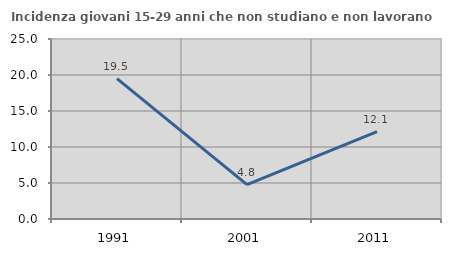
| Category | Incidenza giovani 15-29 anni che non studiano e non lavorano  |
|---|---|
| 1991.0 | 19.501 |
| 2001.0 | 4.784 |
| 2011.0 | 12.143 |